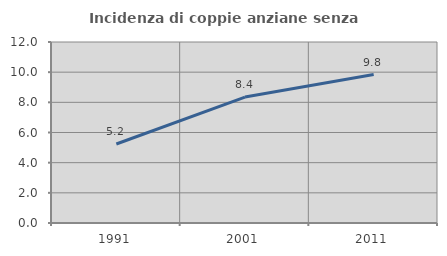
| Category | Incidenza di coppie anziane senza figli  |
|---|---|
| 1991.0 | 5.237 |
| 2001.0 | 8.351 |
| 2011.0 | 9.842 |